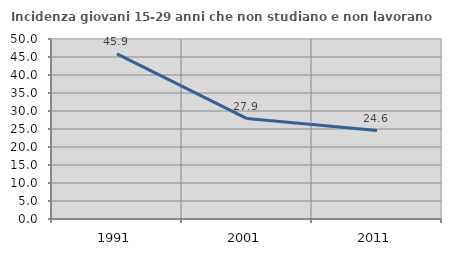
| Category | Incidenza giovani 15-29 anni che non studiano e non lavorano  |
|---|---|
| 1991.0 | 45.871 |
| 2001.0 | 27.899 |
| 2011.0 | 24.569 |